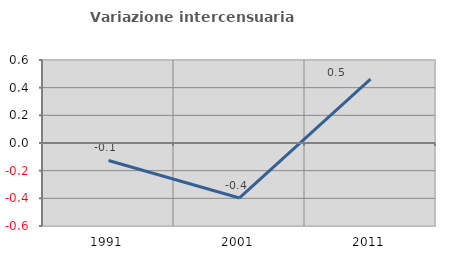
| Category | Variazione intercensuaria annua |
|---|---|
| 1991.0 | -0.127 |
| 2001.0 | -0.397 |
| 2011.0 | 0.462 |